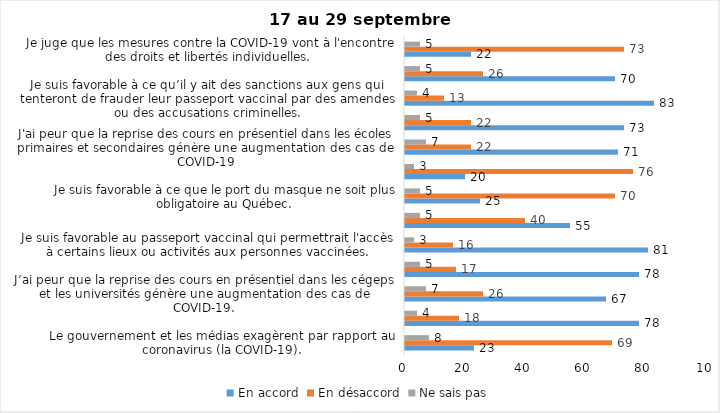
| Category | En accord | En désaccord | Ne sais pas |
|---|---|---|---|
| Le gouvernement et les médias exagèrent par rapport au coronavirus (la COVID-19). | 23 | 69 | 8 |
| J’ai peur que le système de santé soit débordé par les cas de COVID-19. | 78 | 18 | 4 |
| J’ai peur que la reprise des cours en présentiel dans les cégeps et les universités génère une augmentation des cas de COVID-19. | 67 | 26 | 7 |
| Je suis inquiet/inquiète  que le nombre de cas augmente en raison des nouveaux variants du virus de la COVID-19 | 78 | 17 | 5 |
| Je suis favorable au passeport vaccinal qui permettrait l'accès à certains lieux ou activités aux personnes vaccinées. | 81 | 16 | 3 |
| Si les cas de COVID-19 augmentent cet automne, je suis favorable à la mise en place de mesures de confinement (ex. fermeture de services non essentiels, interdiction des rassemblements privés) | 55 | 40 | 5 |
| Je suis favorable à ce que le port du masque ne soit plus obligatoire au Québec. | 25 | 70 | 5 |
| Étant donné la progression de la vaccination, je pense qu’il est moins important de suivre les mesures de prévention. | 20 | 76 | 3 |
| J'ai peur que la reprise des cours en présentiel dans les écoles primaires et secondaires génère une augmentation des cas de COVID-19 | 71 | 22 | 7 |
| Je suis favorable à ce qu’il y ait des sanctions aux commerçants qui ne vérifieront pas le passeport vaccinal (code QR) de leurs clients | 73 | 22 | 5 |
| Je suis favorable à ce qu’il y ait des sanctions aux gens qui tenteront de frauder leur passeport vaccinal par des amendes ou des accusations criminelles. | 83 | 13 | 4 |
| Je crois que le passeport vaccinal devrait être requis pour davantage de services et commerces (ex. : spas, centre d’achats, centre de soins personnels. | 70 | 26 | 5 |
| Je juge que les mesures contre la COVID-19 vont à l'encontre des droits et libertés individuelles.  | 22 | 73 | 5 |